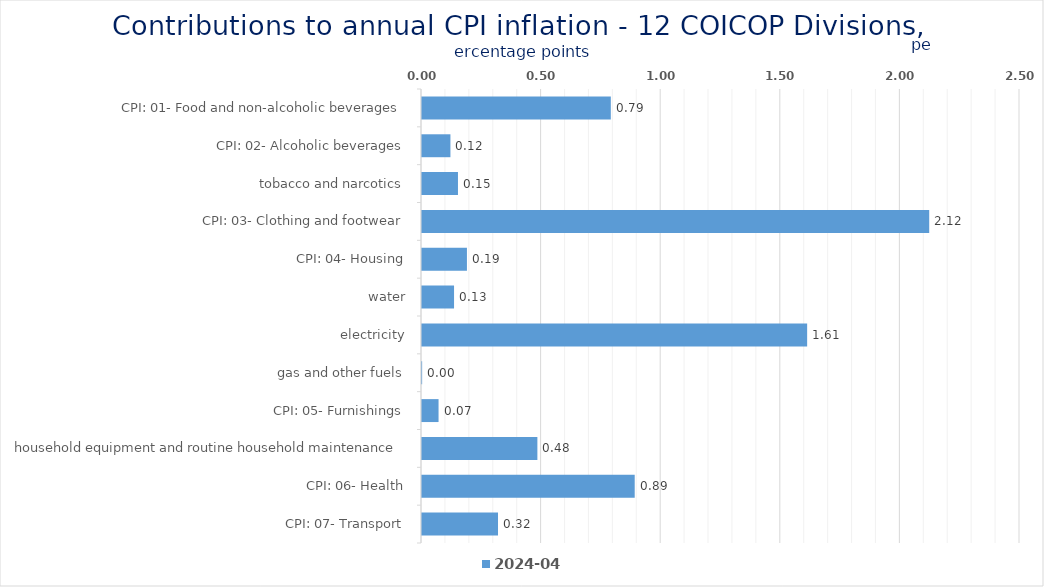
| Category | 2024-04 |
|---|---|
| CPI: 01- Food and non-alcoholic beverages | 0.789 |
| CPI: 02- Alcoholic beverages, tobacco and narcotics | 0.119 |
| CPI: 03- Clothing and footwear | 0.15 |
| CPI: 04- Housing, water, electricity, gas and other fuels | 2.12 |
| CPI: 05- Furnishings, household equipment and routine household maintenance | 0.188 |
| CPI: 06- Health | 0.134 |
| CPI: 07- Transport | 1.61 |
| CPI: 08- Communication | 0.001 |
| CPI: 09- Recreation and culture | 0.069 |
| CPI: 10- Education | 0.482 |
| CPI: 11- Restaurants and hotels | 0.889 |
| CPI: 12- Miscellaneous goods and services | 0.318 |